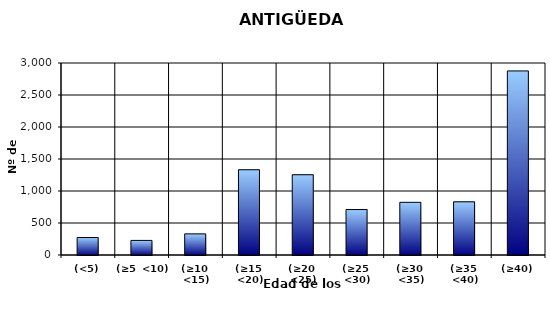
| Category | (<5) |
|---|---|
| (<5) | 273 |
| (≥5  <10) | 228 |
| (≥10  <15) | 330 |
| (≥15  <20) | 1332 |
| (≥20  <25) | 1254 |
| (≥25  <30) | 710 |
| (≥30  <35) | 823 |
| (≥35  <40) | 831 |
| (≥40) | 2876 |